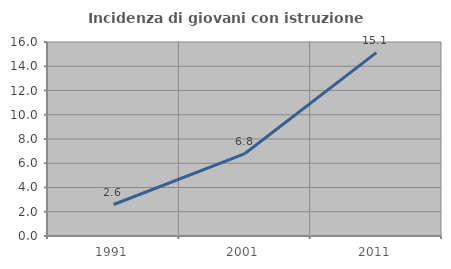
| Category | Incidenza di giovani con istruzione universitaria |
|---|---|
| 1991.0 | 2.597 |
| 2001.0 | 6.801 |
| 2011.0 | 15.12 |